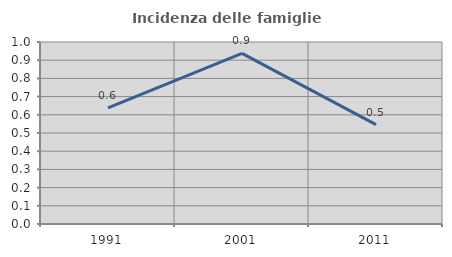
| Category | Incidenza delle famiglie numerose |
|---|---|
| 1991.0 | 0.638 |
| 2001.0 | 0.938 |
| 2011.0 | 0.546 |